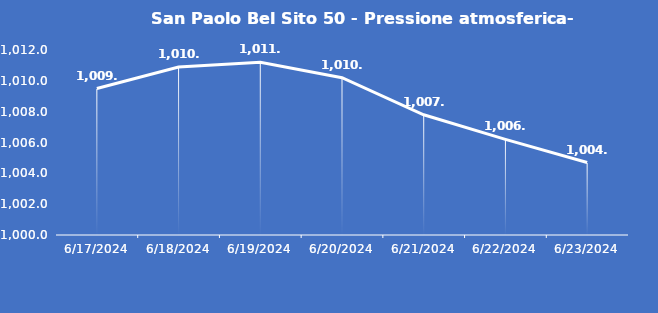
| Category | San Paolo Bel Sito 50 - Pressione atmosferica- Grezzo (hPa) |
|---|---|
| 6/17/24 | 1009.5 |
| 6/18/24 | 1010.9 |
| 6/19/24 | 1011.2 |
| 6/20/24 | 1010.2 |
| 6/21/24 | 1007.8 |
| 6/22/24 | 1006.2 |
| 6/23/24 | 1004.7 |